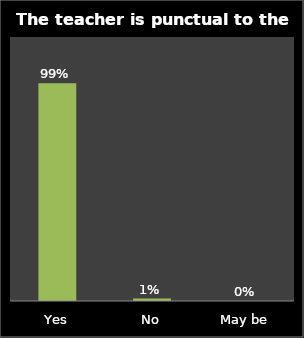
| Category | Series 0 |
|---|---|
| Yes | 0.99 |
| No | 0.011 |
| May be | 0 |